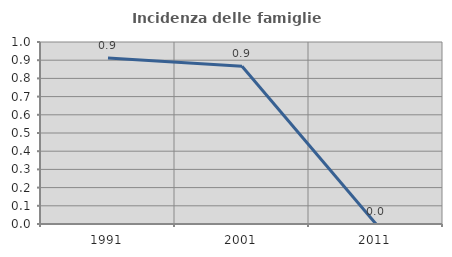
| Category | Incidenza delle famiglie numerose |
|---|---|
| 1991.0 | 0.912 |
| 2001.0 | 0.867 |
| 2011.0 | 0 |